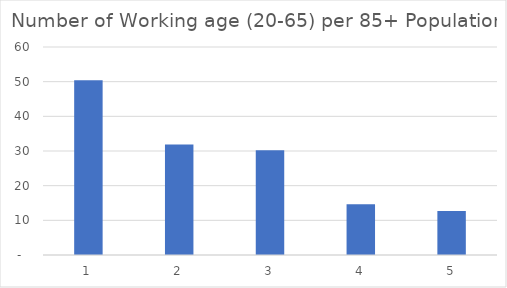
| Category | Number of Working age (20-65) per 85+ Population |
|---|---|
| 0 | 50.386 |
| 1 | 31.894 |
| 2 | 30.25 |
| 3 | 14.655 |
| 4 | 12.7 |